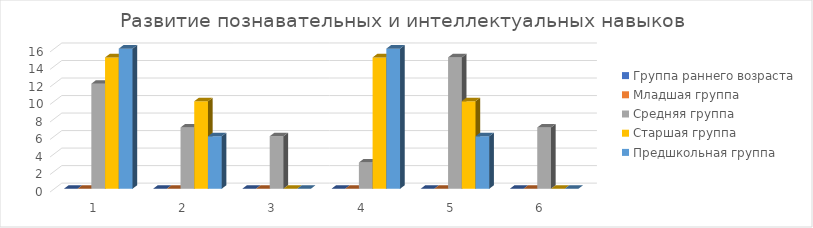
| Category | Группа раннего возраста | Младшая группа | Средняя группа | Старшая группа | Предшкольная группа |
|---|---|---|---|---|---|
| 0 | 0 | 0 | 12 | 15 | 16 |
| 1 | 0 | 0 | 7 | 10 | 6 |
| 2 | 0 | 0 | 6 | 0 | 0 |
| 3 | 0 | 0 | 3 | 15 | 16 |
| 4 | 0 | 0 | 15 | 10 | 6 |
| 5 | 0 | 0 | 7 | 0 | 0 |